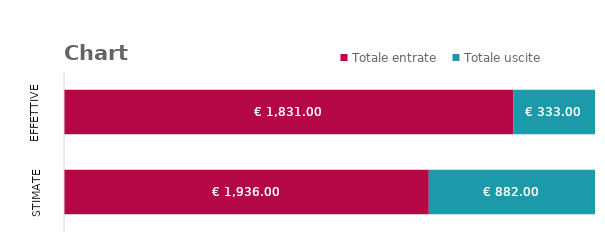
| Category | Totale entrate | Totale uscite |
|---|---|---|
| Stimate | 1936 | 882 |
| Effettive | 1831 | 333 |